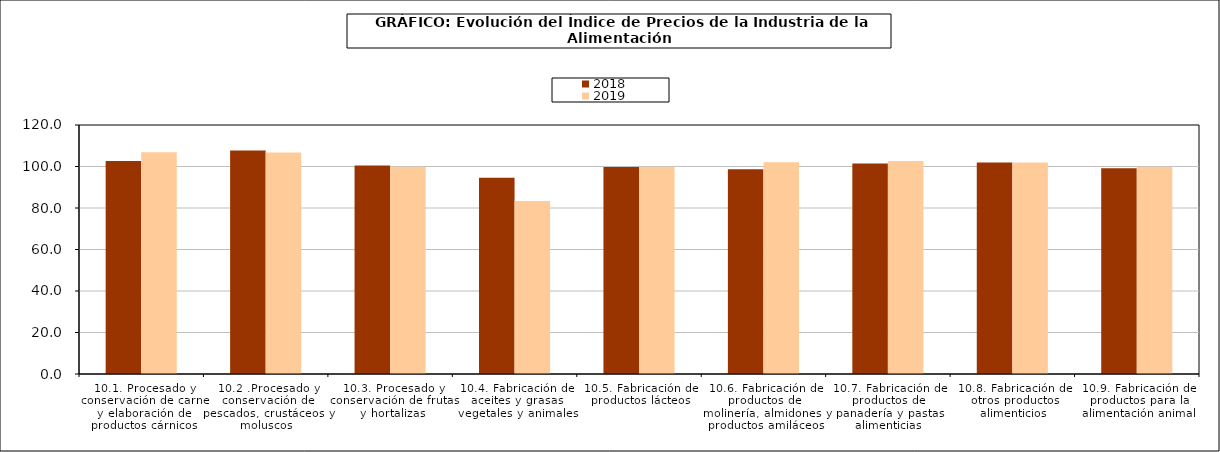
| Category | 2018 | 2019 |
|---|---|---|
| 10.1. Procesado y conservación de carne y elaboración de productos cárnicos | 102.643 | 106.91 |
| 10.2 .Procesado y conservación de pescados, crustáceos y moluscos | 107.763 | 106.698 |
| 10.3. Procesado y conservación de frutas y hortalizas | 100.505 | 99.85 |
| 10.4. Fabricación de aceites y grasas vegetales y animales | 94.55 | 83.344 |
| 10.5. Fabricación de productos lácteos | 99.701 | 99.887 |
| 10.6. Fabricación de productos de molinería, almidones y productos amiláceos | 98.723 | 102.067 |
| 10.7. Fabricación de productos de panadería y pastas alimenticias | 101.466 | 102.697 |
| 10.8. Fabricación de otros productos alimenticios | 101.915 | 101.916 |
| 10.9. Fabricación de productos para la alimentación animal | 99.19 | 99.928 |